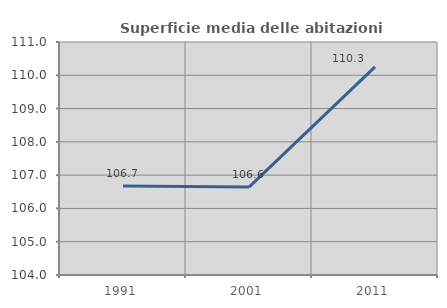
| Category | Superficie media delle abitazioni occupate |
|---|---|
| 1991.0 | 106.677 |
| 2001.0 | 106.642 |
| 2011.0 | 110.253 |